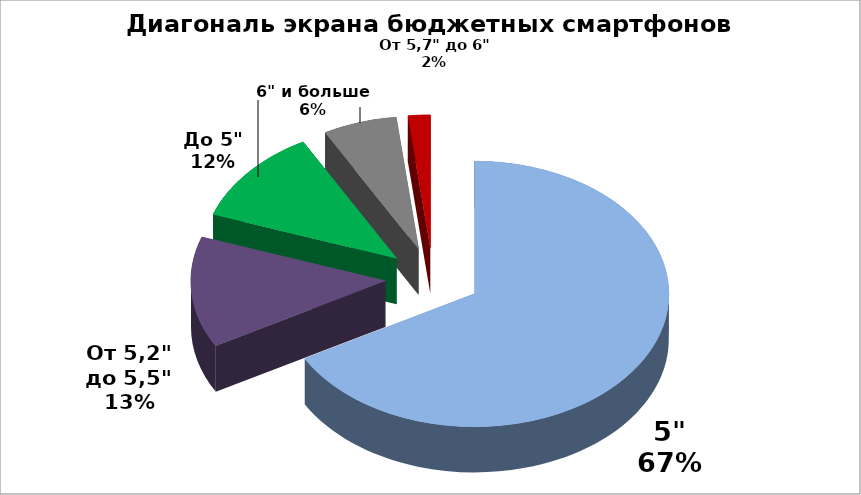
| Category | Series 0 |
|---|---|
| 5" | 109 |
| От 5,2" до 5,5" | 22 |
| До 5" | 19 |
| 6" и больше | 10 |
| От 5,7" до 6" | 3 |